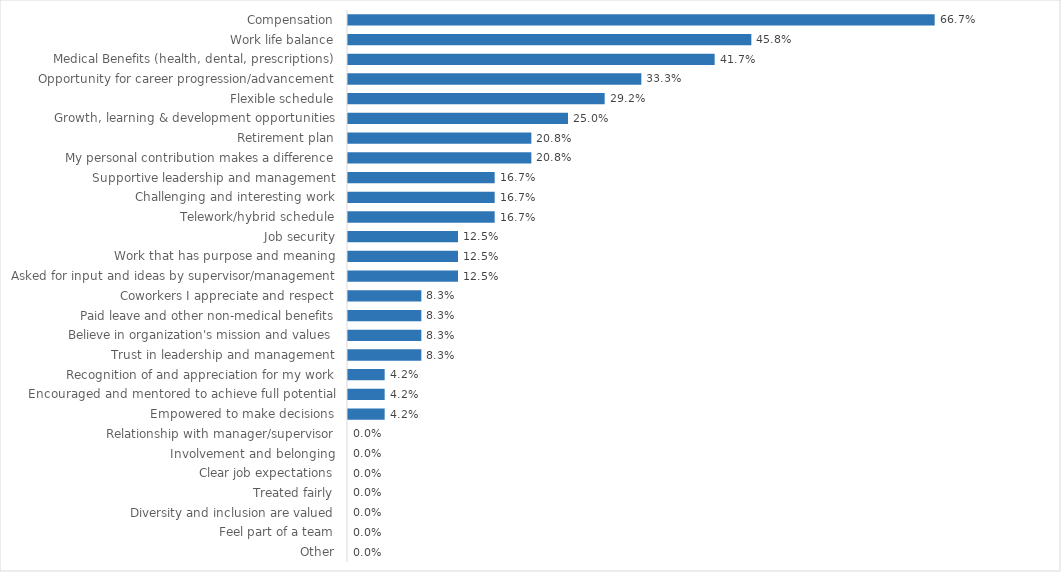
| Category | Defender General |
|---|---|
| Compensation | 0.667 |
| Work life balance | 0.458 |
| Medical Benefits (health, dental, prescriptions) | 0.417 |
| Opportunity for career progression/advancement | 0.333 |
| Flexible schedule | 0.292 |
| Growth, learning & development opportunities | 0.25 |
| Retirement plan | 0.208 |
| My personal contribution makes a difference | 0.208 |
| Supportive leadership and management | 0.167 |
| Challenging and interesting work | 0.167 |
| Telework/hybrid schedule | 0.167 |
| Job security | 0.125 |
| Work that has purpose and meaning | 0.125 |
| Asked for input and ideas by supervisor/management | 0.125 |
| Coworkers I appreciate and respect | 0.083 |
| Paid leave and other non-medical benefits | 0.083 |
| Believe in organization's mission and values | 0.083 |
| Trust in leadership and management | 0.083 |
| Recognition of and appreciation for my work | 0.042 |
| Encouraged and mentored to achieve full potential | 0.042 |
| Empowered to make decisions | 0.042 |
| Relationship with manager/supervisor | 0 |
| Involvement and belonging | 0 |
| Clear job expectations | 0 |
| Treated fairly | 0 |
| Diversity and inclusion are valued | 0 |
| Feel part of a team | 0 |
| Other | 0 |